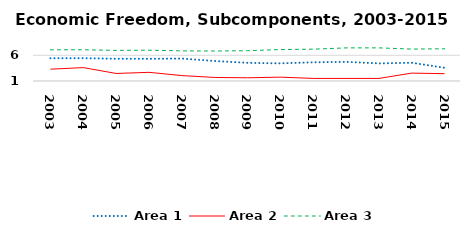
| Category | Area 1 | Area 2 | Area 3 |
|---|---|---|---|
| 2003.0 | 5.426 | 3.297 | 7.068 |
| 2004.0 | 5.435 | 3.602 | 7.075 |
| 2005.0 | 5.326 | 2.466 | 6.955 |
| 2006.0 | 5.319 | 2.684 | 6.99 |
| 2007.0 | 5.36 | 2.054 | 6.858 |
| 2008.0 | 4.89 | 1.688 | 6.832 |
| 2009.0 | 4.532 | 1.625 | 6.891 |
| 2010.0 | 4.43 | 1.75 | 7.115 |
| 2011.0 | 4.632 | 1.5 | 7.188 |
| 2012.0 | 4.723 | 1.5 | 7.437 |
| 2013.0 | 4.421 | 1.5 | 7.443 |
| 2014.0 | 4.555 | 2.536 | 7.206 |
| 2015.0 | 3.572 | 2.424 | 7.264 |